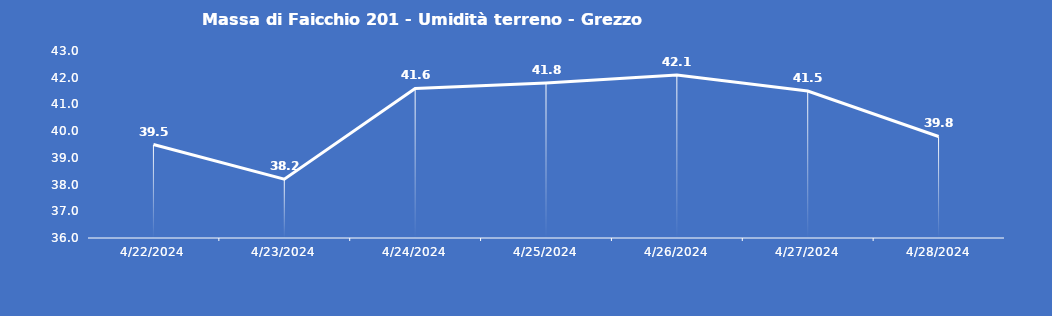
| Category | Massa di Faicchio 201 - Umidità terreno - Grezzo (%VWC) |
|---|---|
| 4/22/24 | 39.5 |
| 4/23/24 | 38.2 |
| 4/24/24 | 41.6 |
| 4/25/24 | 41.8 |
| 4/26/24 | 42.1 |
| 4/27/24 | 41.5 |
| 4/28/24 | 39.8 |